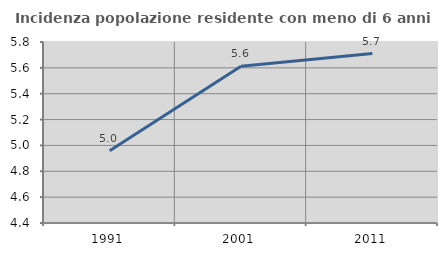
| Category | Incidenza popolazione residente con meno di 6 anni |
|---|---|
| 1991.0 | 4.958 |
| 2001.0 | 5.612 |
| 2011.0 | 5.711 |